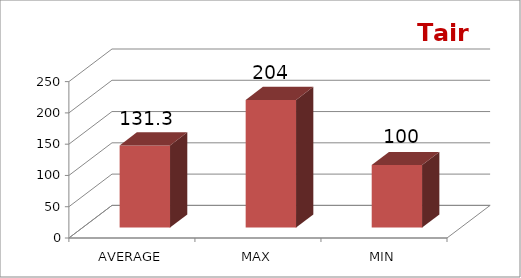
| Category | Series 0 |
|---|---|
| AVERAGE | 131.3 |
| MAX | 204 |
| MIN | 100 |